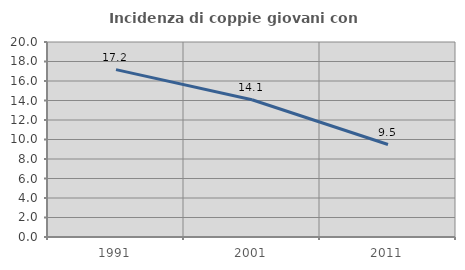
| Category | Incidenza di coppie giovani con figli |
|---|---|
| 1991.0 | 17.166 |
| 2001.0 | 14.072 |
| 2011.0 | 9.485 |